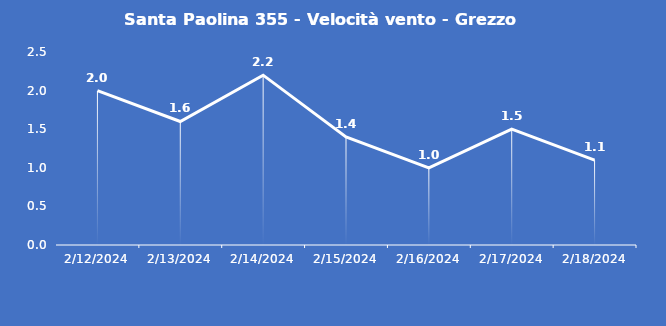
| Category | Santa Paolina 355 - Velocità vento - Grezzo (m/s) |
|---|---|
| 2/12/24 | 2 |
| 2/13/24 | 1.6 |
| 2/14/24 | 2.2 |
| 2/15/24 | 1.4 |
| 2/16/24 | 1 |
| 2/17/24 | 1.5 |
| 2/18/24 | 1.1 |